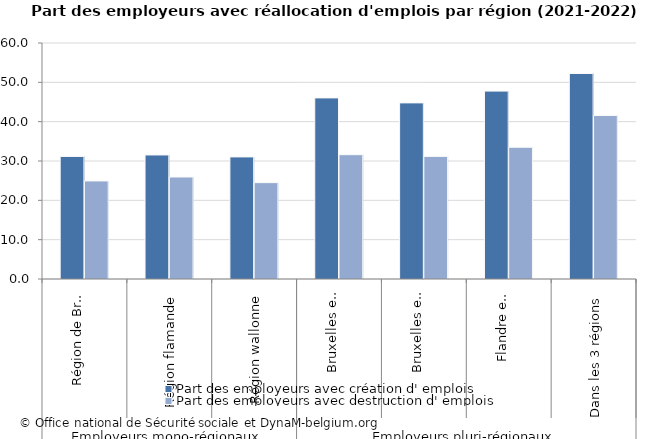
| Category | Part des employeurs avec création d' emplois | Part des employeurs avec destruction d' emplois |
|---|---|---|
| 0 | 31.16 | 24.929 |
| 1 | 31.535 | 25.932 |
| 2 | 31.043 | 24.5 |
| 3 | 46.042 | 31.602 |
| 4 | 44.775 | 31.171 |
| 5 | 47.77 | 33.496 |
| 6 | 52.243 | 41.557 |